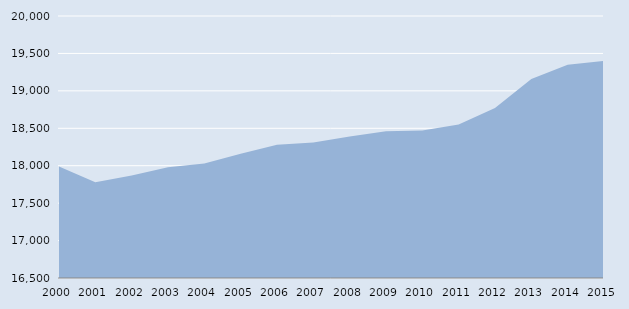
| Category | Series 0 |
|---|---|
| 2000.0 | 17990 |
| 2001.0 | 17780 |
| 2002.0 | 17870 |
| 2003.0 | 17980 |
| 2004.0 | 18030 |
| 2005.0 | 18160 |
| 2006.0 | 18280 |
| 2007.0 | 18310 |
| 2008.0 | 18390 |
| 2009.0 | 18460 |
| 2010.0 | 18470 |
| 2011.0 | 18550 |
| 2012.0 | 18770 |
| 2013.0 | 19160 |
| 2014.0 | 19350 |
| 2015.0 | 19400 |